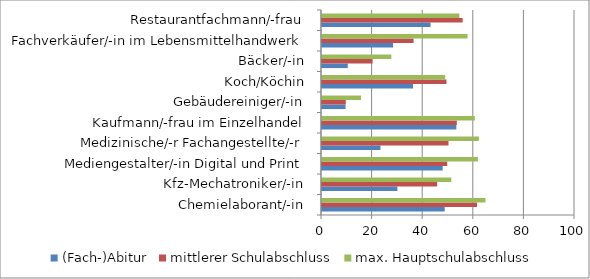
| Category | (Fach-)Abitur | mittlerer Schulabschluss | max. Hauptschulabschluss |
|---|---|---|---|
| Chemielaborant/-in | 48.5 | 61.3 | 64.6 |
| Kfz-Mechatroniker/-in | 29.8 | 45.5 | 51.1 |
| Mediengestalter/-in Digital und Print | 47.7 | 49.5 | 61.6 |
| Medizinische/-r Fachangestellte/-r | 23.1 | 50 | 62 |
| Kaufmann/-frau im Einzelhandel | 53.1 | 53.3 | 60.4 |
| Gebäudereiniger/-in | 9.3 | 9.4 | 15.4 |
| Koch/Köchin | 36 | 49.2 | 48.7 |
| Bäcker/-in | 10.2 | 20 | 27.4 |
| Fachverkäufer/-in im Lebensmittelhandwerk | 28.1 | 36.2 | 57.5 |
| Restaurantfachmann/-frau | 42.9 | 55.6 | 54.3 |